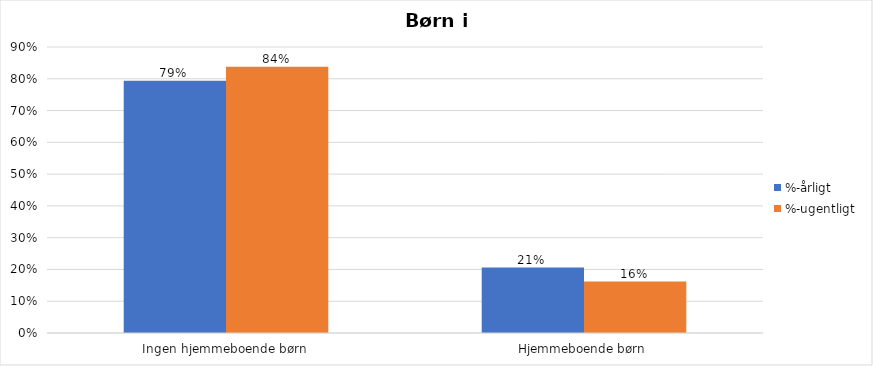
| Category | %-årligt | %-ugentligt |
|---|---|---|
| Ingen hjemmeboende børn | 0.794 | 0.838 |
| Hjemmeboende børn | 0.206 | 0.162 |